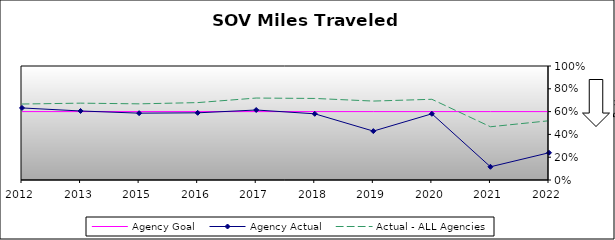
| Category | Agency Goal | Agency Actual | Actual - ALL Agencies |
|---|---|---|---|
| 2012.0 | 0.6 | 0.632 | 0.666 |
| 2013.0 | 0.6 | 0.606 | 0.674 |
| 2015.0 | 0.6 | 0.586 | 0.668 |
| 2016.0 | 0.6 | 0.589 | 0.679 |
| 2017.0 | 0.6 | 0.614 | 0.719 |
| 2018.0 | 0.6 | 0.581 | 0.715 |
| 2019.0 | 0.6 | 0.429 | 0.692 |
| 2020.0 | 0.6 | 0.581 | 0.708 |
| 2021.0 | 0.6 | 0.116 | 0.467 |
| 2022.0 | 0.6 | 0.239 | 0.52 |